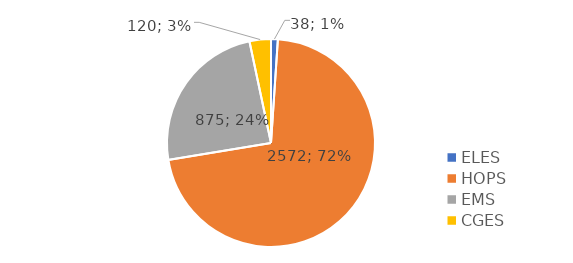
| Category | Series 0 |
|---|---|
| ELES | 38 |
| HOPS | 2572 |
| EMS | 875 |
| CGES | 120 |